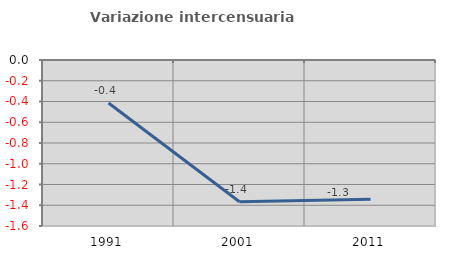
| Category | Variazione intercensuaria annua |
|---|---|
| 1991.0 | -0.414 |
| 2001.0 | -1.366 |
| 2011.0 | -1.342 |